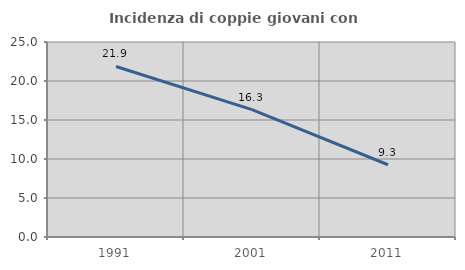
| Category | Incidenza di coppie giovani con figli |
|---|---|
| 1991.0 | 21.862 |
| 2001.0 | 16.329 |
| 2011.0 | 9.261 |